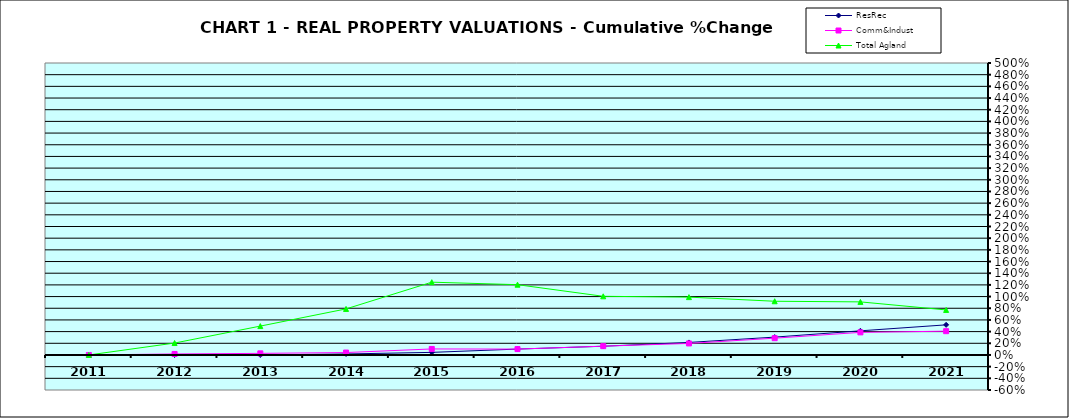
| Category | ResRec | Comm&Indust | Total Agland |
|---|---|---|---|
| 2011.0 | 0 | 0 | 0 |
| 2012.0 | -0.002 | 0.017 | 0.204 |
| 2013.0 | 0 | 0.027 | 0.494 |
| 2014.0 | 0.017 | 0.041 | 0.789 |
| 2015.0 | 0.044 | 0.103 | 1.246 |
| 2016.0 | 0.101 | 0.101 | 1.204 |
| 2017.0 | 0.149 | 0.151 | 1.005 |
| 2018.0 | 0.215 | 0.197 | 0.991 |
| 2019.0 | 0.306 | 0.287 | 0.92 |
| 2020.0 | 0.413 | 0.387 | 0.909 |
| 2021.0 | 0.516 | 0.407 | 0.771 |